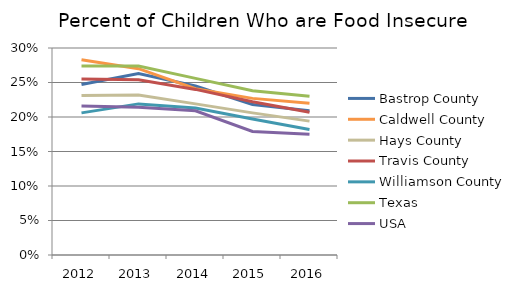
| Category | Bastrop County | Caldwell County | Hays County | Travis County | Williamson County | Texas | USA |
|---|---|---|---|---|---|---|---|
| 2012.0 | 0.247 | 0.283 | 0.231 | 0.255 | 0.206 | 0.274 | 0.216 |
| 2013.0 | 0.263 | 0.27 | 0.232 | 0.254 | 0.219 | 0.274 | 0.214 |
| 2014.0 | 0.245 | 0.241 | 0.219 | 0.24 | 0.213 | 0.256 | 0.209 |
| 2015.0 | 0.218 | 0.227 | 0.206 | 0.222 | 0.197 | 0.238 | 0.179 |
| 2016.0 | 0.209 | 0.22 | 0.194 | 0.207 | 0.182 | 0.23 | 0.175 |